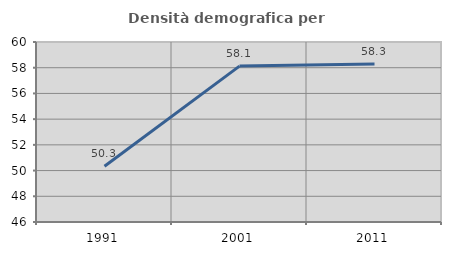
| Category | Densità demografica |
|---|---|
| 1991.0 | 50.333 |
| 2001.0 | 58.125 |
| 2011.0 | 58.281 |